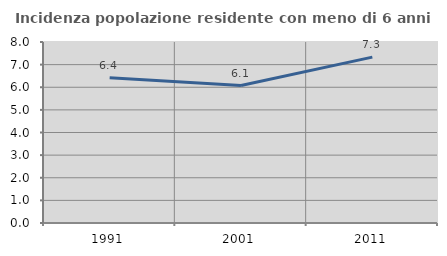
| Category | Incidenza popolazione residente con meno di 6 anni |
|---|---|
| 1991.0 | 6.415 |
| 2001.0 | 6.075 |
| 2011.0 | 7.33 |